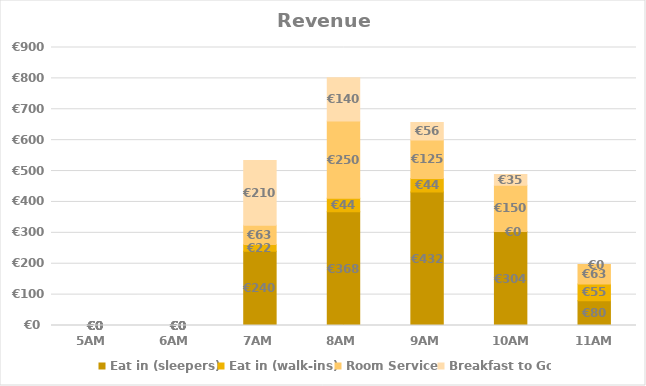
| Category | Eat in (sleepers) | Eat in (walk-ins) | Room Service | Breakfast to Go |
|---|---|---|---|---|
| 5AM | 0 | 0 | 0 | 0 |
| 6AM | 0 | 0 | 0 | 0 |
| 7AM | 240 | 21.9 | 62.5 | 210 |
| 8AM | 368 | 43.8 | 250 | 140 |
| 9AM | 432 | 43.8 | 125 | 56 |
| 10AM | 304 | 0 | 150 | 35 |
| 11AM | 80 | 54.75 | 62.5 | 0 |